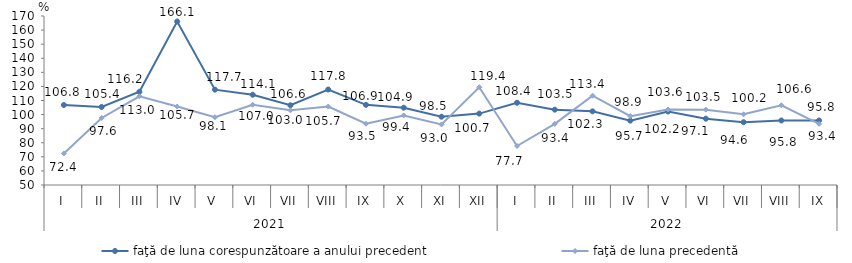
| Category | faţă de luna corespunzătoare a anului precedent | faţă de luna precedentă   |
|---|---|---|
| 0 | 106.8 | 72.4 |
| 1 | 105.4 | 97.6 |
| 2 | 116.2 | 113 |
| 3 | 166.1 | 105.7 |
| 4 | 117.7 | 98.1 |
| 5 | 114.1 | 107 |
| 6 | 106.6 | 103 |
| 7 | 117.8 | 105.7 |
| 8 | 106.9 | 93.5 |
| 9 | 104.9 | 99.4 |
| 10 | 98.5 | 93 |
| 11 | 100.7 | 119.4 |
| 12 | 108.4 | 77.7 |
| 13 | 103.5 | 93.4 |
| 14 | 102.3 | 113.4 |
| 15 | 95.7 | 98.9 |
| 16 | 102.2 | 103.6 |
| 17 | 97.1 | 103.5 |
| 18 | 94.6 | 100.2 |
| 19 | 95.8 | 106.6 |
| 20 | 95.8 | 93.4 |